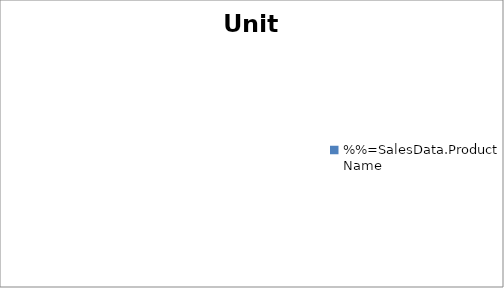
| Category | Unit Sales |
|---|---|
| %%=SalesData.ProductName | 0 |